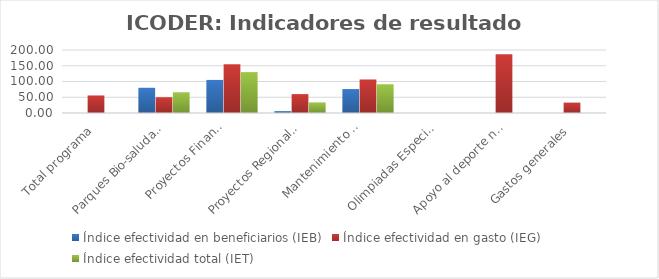
| Category | Índice efectividad en beneficiarios (IEB) | Índice efectividad en gasto (IEG)  | Índice efectividad total (IET) |
|---|---|---|---|
| Total programa | 0 | 55.701 | 0 |
| Parques Bio-saludables | 80 | 50.113 | 65.057 |
| Proyectos Financiados 
a CCDR | 105 | 154.719 | 129.859 |
| Proyectos Regionales  | 6 | 60 | 33 |
| Mantenimiento de 
Instalaciones Deportivas  | 76 | 106.414 | 91.207 |
| Olimpiadas Especiales  | 0 | 0 | 0 |
| Apoyo al deporte nacional | 0 | 186.304 | 0 |
| Gastos generales | 0 | 32.861 | 0 |